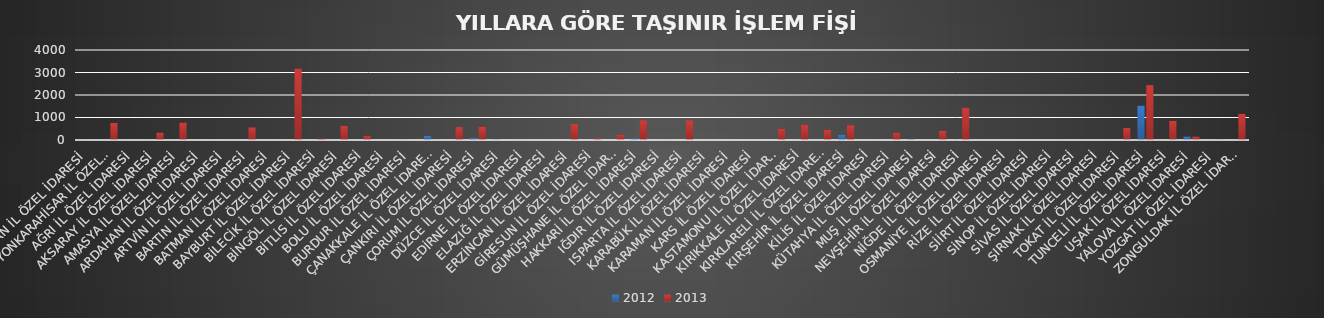
| Category | 2012 | 2013 |
|---|---|---|
| ADIYAMAN İL ÖZEL İDARESİ | 0 | 0 |
| AFYONKARAHİSAR İL ÖZEL İDARESİ | 5 | 760 |
| AĞRI İL ÖZEL İDARESİ | 0 | 0 |
| AKSARAY İL ÖZEL İDARESİ | 0 | 322 |
| AMASYA İL ÖZEL İDARESİ | 0 | 775 |
| ARDAHAN İL ÖZEL İDARESİ | 0 | 0 |
| ARTVİN İL ÖZEL İDARESİ | 0 | 0 |
| BARTIN İL ÖZEL İDARESİ | 0 | 556 |
| BATMAN İL ÖZEL İDARESİ | 0 | 0 |
| BAYBURT İL ÖZEL İDARESİ | 0 | 3175 |
| BİLECİK İL ÖZEL İDARESİ | 0 | 63 |
| BİNGÖL İL ÖZEL İDARESİ | 0 | 627 |
| BİTLİS İL ÖZEL İDARESİ | 0 | 186 |
| BOLU İL ÖZEL İDARESİ | 0 | 1 |
| BURDUR İL ÖZEL İDARESİ | 12 | 0 |
| ÇANAKKALE İL ÖZEL İDARESİ | 181 | 13 |
| ÇANKIRI İL ÖZEL İDARESİ | 0 | 575 |
| ÇORUM İL ÖZEL İDARESİ | 92 | 597 |
| DÜZCE İL ÖZEL İDARESİ | 21 | 0 |
| EDİRNE İL ÖZEL İDARESİ | 0 | 0 |
| ELAZIĞ İL ÖZEL İDARESİ | 0 | 0 |
| ERZİNCAN İL ÖZEL İDARESİ | 0 | 712 |
| GİRESUN İL ÖZEL İDARESİ | 2 | 67 |
| GÜMÜŞHANE İL ÖZEL İDARESİ | 0 | 235 |
| HAKKARİ İL ÖZEL İDARESİ | 70 | 874 |
| IĞDIR İL ÖZEL İDARESİ | 2 | 7 |
| ISPARTA İL ÖZEL İDARESİ | 0 | 869 |
| KARABÜK İL ÖZEL İDARESİ | 0 | 0 |
| KARAMAN İL ÖZEL İDARESİ | 0 | 3 |
| KARS İL ÖZEL İDARESİ | 0 | 0 |
| KASTAMONU İL ÖZEL İDARESİ | 1 | 507 |
| KIRIKKALE İL ÖZEL İDARESİ | 0 | 684 |
| KIRKLARELİ İL ÖZEL İDARESİ | 0 | 452 |
| KIRŞEHİR İL ÖZEL İDARESİ | 232 | 653 |
| KİLİS İL ÖZEL İDARESİ | 0 | 0 |
| KÜTAHYA İL ÖZEL İDARESİ | 0 | 330 |
| MUŞ İL ÖZEL İDARESİ | 41 | 0 |
| NEVŞEHİR İL ÖZEL İDARESİ | 0 | 413 |
| NİĞDE İL ÖZEL İDARESİ | 0 | 1435 |
| OSMANİYE İL ÖZEL İDARESİ | 0 | 2 |
| RİZE İL ÖZEL İDARESİ | 0 | 0 |
| SİİRT İL ÖZEL İDARESİ | 0 | 0 |
| SİNOP İL ÖZEL İDARESİ | 0 | 0 |
| SİVAS İL ÖZEL İDARESİ | 0 | 0 |
| ŞIRNAK İL ÖZEL İDARESİ | 0 | 0 |
| TOKAT İL ÖZEL İDARESİ | 0 | 529 |
| TUNCELİ İL ÖZEL İDARESİ | 1524 | 2438 |
| UŞAK İL ÖZEL İDARESİ | 0 | 849 |
| YALOVA İL ÖZEL İDARESİ | 155 | 154 |
| YOZGAT İL ÖZEL İDARESİ | 0 | 10 |
| ZONGULDAK İL ÖZEL İDARESİ | 0 | 1163 |